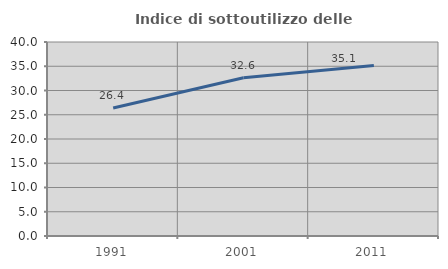
| Category | Indice di sottoutilizzo delle abitazioni  |
|---|---|
| 1991.0 | 26.375 |
| 2001.0 | 32.631 |
| 2011.0 | 35.141 |